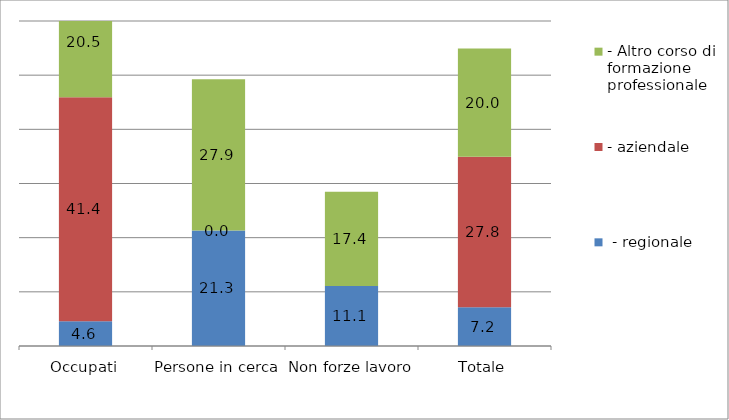
| Category |  - regionale | - aziendale | - Altro corso di formazione professionale |
|---|---|---|---|
| Occupati | 4.57 | 41.353 | 20.499 |
| Persone in cerca | 21.318 | 0 | 27.909 |
| Non forze lavoro | 11.075 | 0 | 17.389 |
| Totale | 7.169 | 27.781 | 19.953 |